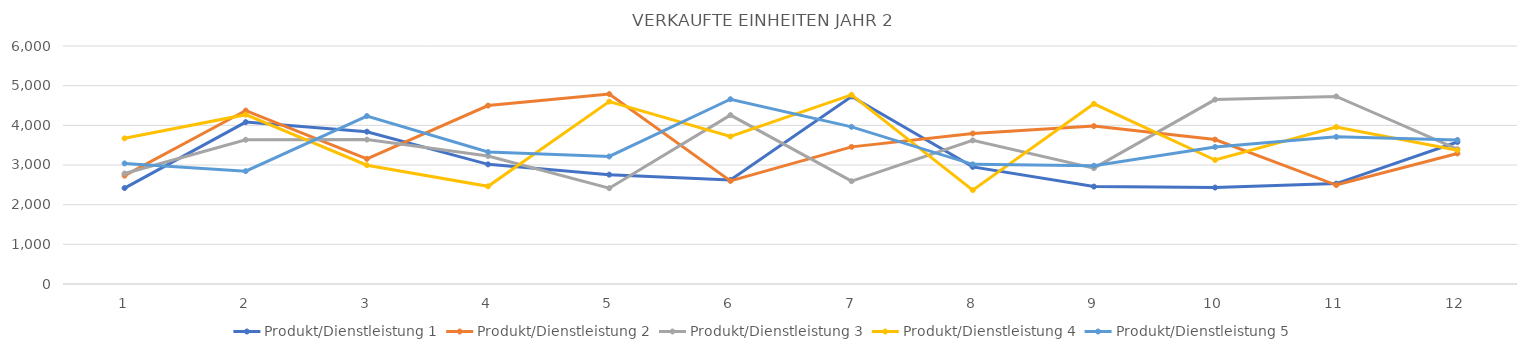
| Category | Produkt/Dienstleistung 1 | Produkt/Dienstleistung 2 | Produkt/Dienstleistung 3 | Produkt/Dienstleistung 4 | Produkt/Dienstleistung 5 |
|---|---|---|---|---|---|
| 0 | 2418 | 2732 | 2786 | 3672 | 3039 |
| 1 | 4081 | 4373 | 3636 | 4269 | 2845 |
| 2 | 3840 | 3155 | 3640 | 2995 | 4234 |
| 3 | 3016 | 4498 | 3226 | 2463 | 3327 |
| 4 | 2757 | 4788 | 2416 | 4599 | 3215 |
| 5 | 2625 | 2598 | 4258 | 3719 | 4658 |
| 6 | 4729 | 3457 | 2592 | 4768 | 3962 |
| 7 | 2952 | 3795 | 3620 | 2366 | 3017 |
| 8 | 2456 | 3981 | 2921 | 4542 | 2982 |
| 9 | 2431 | 3641 | 4649 | 3126 | 3454 |
| 10 | 2531 | 2495 | 4729 | 3958 | 3710 |
| 11 | 3580 | 3291 | 3400 | 3372 | 3632 |